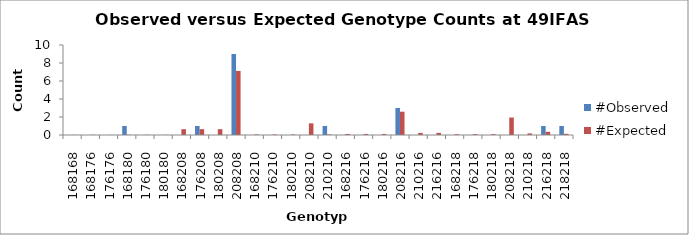
| Category | #Observed | #Expected |
|---|---|---|
| 168168.0 | 0 | 0.015 |
| 168176.0 | 0 | 0.029 |
| 176176.0 | 0 | 0.015 |
| 168180.0 | 1 | 0.029 |
| 176180.0 | 0 | 0.029 |
| 180180.0 | 0 | 0.015 |
| 168208.0 | 0 | 0.647 |
| 176208.0 | 1 | 0.647 |
| 180208.0 | 0 | 0.647 |
| 208208.0 | 9 | 7.118 |
| 168210.0 | 0 | 0.059 |
| 176210.0 | 0 | 0.059 |
| 180210.0 | 0 | 0.059 |
| 208210.0 | 0 | 1.294 |
| 210210.0 | 1 | 0.059 |
| 168216.0 | 0 | 0.118 |
| 176216.0 | 0 | 0.118 |
| 180216.0 | 0 | 0.118 |
| 208216.0 | 3 | 2.588 |
| 210216.0 | 0 | 0.235 |
| 216216.0 | 0 | 0.235 |
| 168218.0 | 0 | 0.088 |
| 176218.0 | 0 | 0.088 |
| 180218.0 | 0 | 0.088 |
| 208218.0 | 0 | 1.941 |
| 210218.0 | 0 | 0.176 |
| 216218.0 | 1 | 0.353 |
| 218218.0 | 1 | 0.132 |